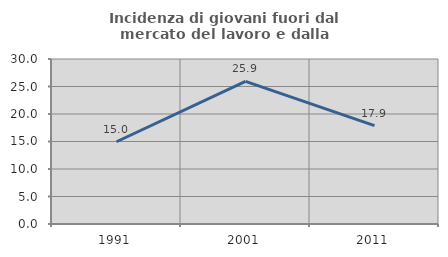
| Category | Incidenza di giovani fuori dal mercato del lavoro e dalla formazione  |
|---|---|
| 1991.0 | 14.952 |
| 2001.0 | 25.936 |
| 2011.0 | 17.876 |